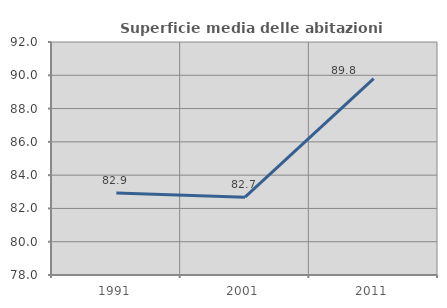
| Category | Superficie media delle abitazioni occupate |
|---|---|
| 1991.0 | 82.928 |
| 2001.0 | 82.674 |
| 2011.0 | 89.805 |